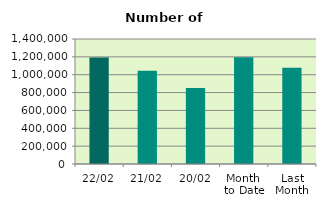
| Category | Series 0 |
|---|---|
| 22/02 | 1193010 |
| 21/02 | 1045444 |
| 20/02 | 850124 |
| Month 
to Date | 1194319 |
| Last
Month | 1077187.636 |